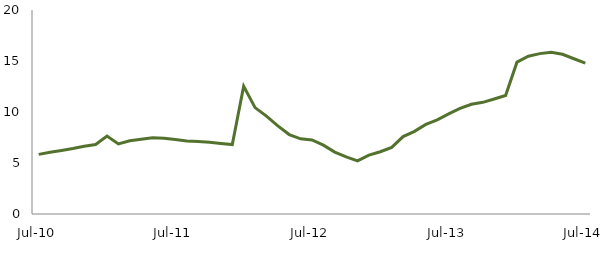
| Category | Series 0 |
|---|---|
| Jul-10 | 5.848 |
|  | 6.049 |
|  | 6.231 |
|  | 6.424 |
|  | 6.645 |
|  | 6.81 |
|  | 7.648 |
|  | 6.876 |
|  | 7.18 |
|  | 7.339 |
|  | 7.477 |
|  | 7.434 |
| Jul-11 | 7.306 |
|  | 7.15 |
|  | 7.099 |
|  | 7.034 |
|  | 6.917 |
|  | 6.811 |
|  | 12.531 |
|  | 10.433 |
|  | 9.6 |
|  | 8.643 |
|  | 7.789 |
|  | 7.371 |
| Jul-12 | 7.266 |
|  | 6.753 |
|  | 6.075 |
|  | 5.6 |
|  | 5.212 |
|  | 5.768 |
|  | 6.103 |
|  | 6.533 |
|  | 7.592 |
|  | 8.106 |
|  | 8.783 |
|  | 9.237 |
| Jul-13 | 9.823 |
|  | 10.349 |
|  | 10.753 |
|  | 10.947 |
|  | 11.281 |
|  | 11.624 |
|  | 14.885 |
|  | 15.473 |
|  | 15.725 |
|  | 15.855 |
|  | 15.657 |
|  | 15.222 |
| Jul-14 | 14.798 |